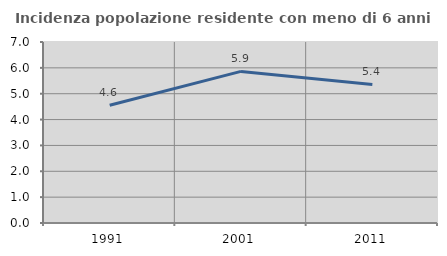
| Category | Incidenza popolazione residente con meno di 6 anni |
|---|---|
| 1991.0 | 4.551 |
| 2001.0 | 5.863 |
| 2011.0 | 5.358 |